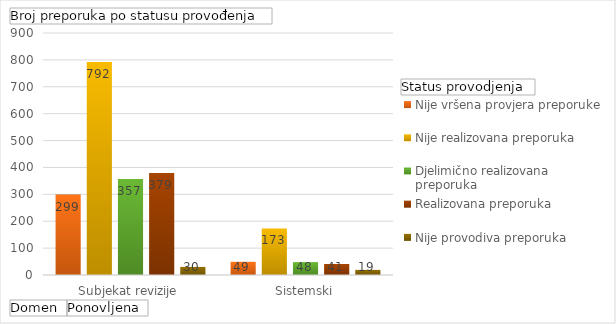
| Category | Nije vršena provjera preporuke | Nije realizovana preporuka | Djelimično realizovana preporuka | Realizovana preporuka | Nije provodiva preporuka |
|---|---|---|---|---|---|
| Subjekat revizije | 299 | 792 | 357 | 379 | 30 |
| Sistemski | 49 | 173 | 48 | 41 | 19 |